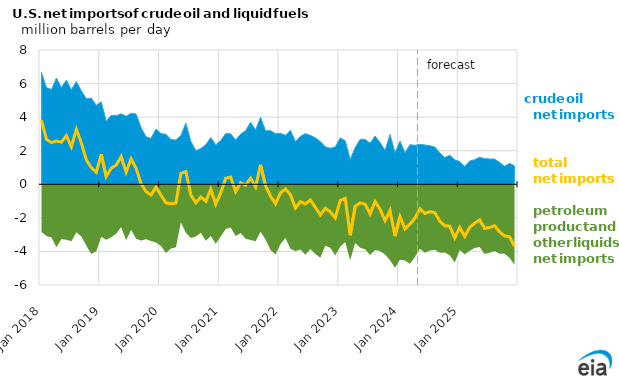
| Category | total net imports  |
|---|---|
| 2018-01-01 | 3.819 |
| 2018-02-01 | 2.679 |
| 2018-03-01 | 2.485 |
| 2018-04-01 | 2.578 |
| 2018-05-01 | 2.51 |
| 2018-06-01 | 2.902 |
| 2018-07-01 | 2.231 |
| 2018-08-01 | 3.27 |
| 2018-09-01 | 2.474 |
| 2018-10-01 | 1.457 |
| 2018-11-01 | 0.991 |
| 2018-12-01 | 0.72 |
| 2019-01-01 | 1.786 |
| 2019-02-01 | 0.452 |
| 2019-03-01 | 0.959 |
| 2019-04-01 | 1.143 |
| 2019-05-01 | 1.655 |
| 2019-06-01 | 0.72 |
| 2019-07-01 | 1.517 |
| 2019-08-01 | 0.949 |
| 2019-09-01 | 0.04 |
| 2019-10-01 | -0.44 |
| 2019-11-01 | -0.638 |
| 2019-12-01 | -0.171 |
| 2020-01-01 | -0.649 |
| 2020-02-01 | -1.108 |
| 2020-03-01 | -1.162 |
| 2020-04-01 | -1.112 |
| 2020-05-01 | 0.65 |
| 2020-06-01 | 0.76 |
| 2020-07-01 | -0.639 |
| 2020-08-01 | -1.1 |
| 2020-09-01 | -0.756 |
| 2020-10-01 | -1.013 |
| 2020-11-01 | -0.297 |
| 2020-12-01 | -1.186 |
| 2021-01-01 | -0.501 |
| 2021-02-01 | 0.357 |
| 2021-03-01 | 0.431 |
| 2021-04-01 | -0.441 |
| 2021-05-01 | 0.098 |
| 2021-06-01 | -0.056 |
| 2021-07-01 | 0.368 |
| 2021-08-01 | -0.153 |
| 2021-09-01 | 1.162 |
| 2021-10-01 | -0.09 |
| 2021-11-01 | -0.71 |
| 2021-12-01 | -1.161 |
| 2022-01-01 | -0.513 |
| 2022-02-01 | -0.278 |
| 2022-03-01 | -0.621 |
| 2022-04-01 | -1.418 |
| 2022-05-01 | -1.031 |
| 2022-06-01 | -1.173 |
| 2022-07-01 | -0.931 |
| 2022-08-01 | -1.38 |
| 2022-09-01 | -1.825 |
| 2022-10-01 | -1.43 |
| 2022-11-01 | -1.637 |
| 2022-12-01 | -2.009 |
| 2023-01-01 | -0.964 |
| 2023-02-01 | -0.843 |
| 2023-03-01 | -3.035 |
| 2023-04-01 | -1.312 |
| 2023-05-01 | -1.1 |
| 2023-06-01 | -1.192 |
| 2023-07-01 | -1.758 |
| 2023-08-01 | -1.03 |
| 2023-09-01 | -1.485 |
| 2023-10-01 | -2.16 |
| 2023-11-01 | -1.556 |
| 2023-12-01 | -3.085 |
| 2024-01-01 | -1.923 |
| 2024-02-01 | -2.658 |
| 2024-03-01 | -2.377 |
| 2024-04-01 | -2.014 |
| 2024-05-01 | -1.456 |
| 2024-06-01 | -1.738 |
| 2024-07-01 | -1.635 |
| 2024-08-01 | -1.686 |
| 2024-09-01 | -2.194 |
| 2024-10-01 | -2.47 |
| 2024-11-01 | -2.5 |
| 2024-12-01 | -3.197 |
| 2025-01-01 | -2.568 |
| 2025-02-01 | -3.104 |
| 2025-03-01 | -2.566 |
| 2025-04-01 | -2.322 |
| 2025-05-01 | -2.121 |
| 2025-06-01 | -2.63 |
| 2025-07-01 | -2.571 |
| 2025-08-01 | -2.47 |
| 2025-09-01 | -2.831 |
| 2025-10-01 | -3.072 |
| 2025-11-01 | -3.131 |
| 2025-12-01 | -3.691 |